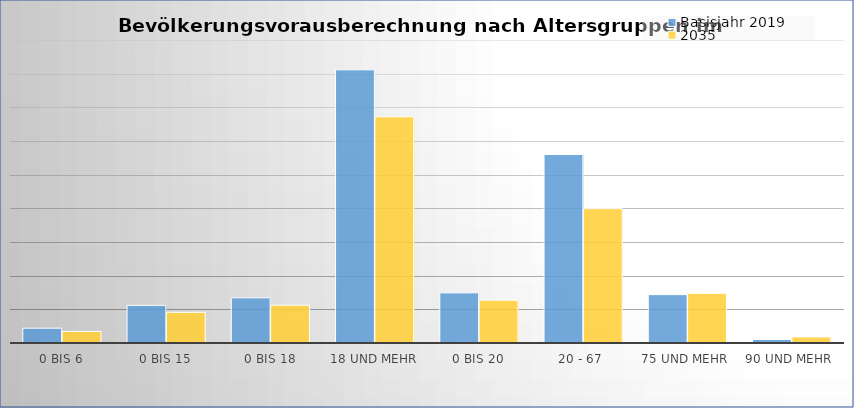
| Category | Basisjahr 2019 | 2035 |
|---|---|---|
| 0 bis 6 | 8800 | 6884 |
| 0 bis 15 | 22370 | 18228 |
| 0 bis 18 | 26828 | 22468 |
| 18 und mehr | 162297 | 134351 |
| 0 bis 20 | 29792 | 25441 |
| 20 - 67  | 112003 | 79795 |
| 75 und mehr  | 28731 | 29527 |
| 90 und mehr  | 2134 | 3604 |